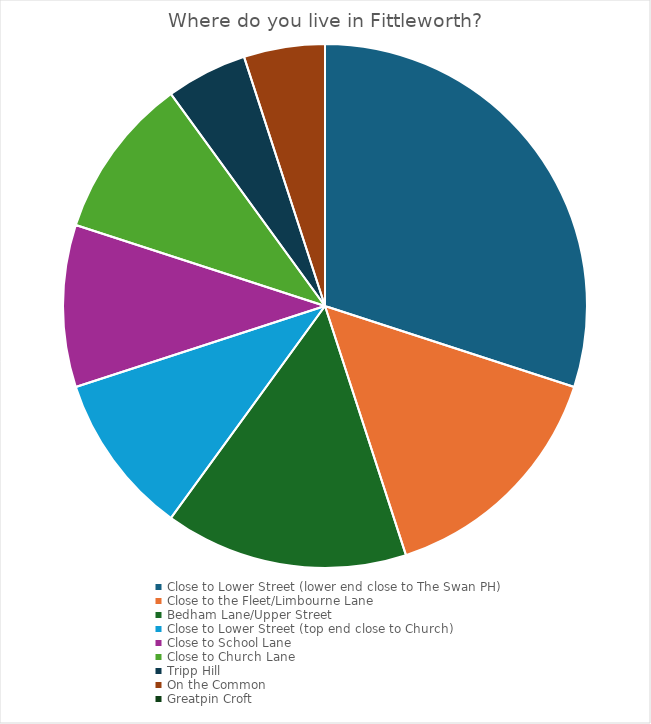
| Category | Series 0 |
|---|---|
| Close to Lower Street (lower end close to The Swan PH) | 6 |
| Close to the Fleet/Limbourne Lane | 3 |
| Bedham Lane/Upper Street | 3 |
| Close to Lower Street (top end close to Church) | 2 |
| Close to School Lane | 2 |
| Close to Church Lane | 2 |
| Tripp Hill | 1 |
| On the Common | 1 |
| Greatpin Croft | 0 |